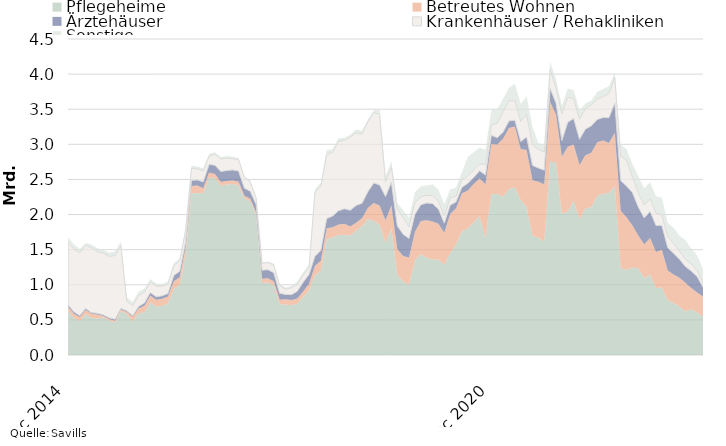
| Category | Pflegeheime | Betreutes Wohnen | Ärztehäuser | Krankenhäuser / Rehakliniken | Sonstige |
|---|---|---|---|---|---|
| 2014-12-01 | 633736081 | 57759854 | 25749999 | 891599738 | 64340644 |
| 2015-01-01 | 530736081 | 57759854 | 25749999 | 891599738 | 71465644 |
| 2015-02-01 | 483168082 | 57759854 | 20749999 | 896099737 | 47465644 |
| 2015-03-01 | 584248082 | 57759854 | 20749999 | 897080987 | 35574599 |
| 2015-04-01 | 529356082 | 57759854 | 15749999 | 924420986 | 46426599 |
| 2015-05-01 | 520608080 | 57759854 | 15749999 | 878720989 | 46426599 |
| 2015-06-01 | 533256112 | 23084854 | 15749999 | 876900990 | 49446599 |
| 2015-07-01 | 490421115 | 23084854 | 15749999 | 875398489 | 52902199 |
| 2015-08-01 | 463331115 | 23084854 | 22535999 | 907658735 | 59202199 |
| 2015-09-01 | 621256115 | 25684854 | 16839999 | 894158738 | 54702200 |
| 2015-10-01 | 587326115 | 25684854 | 16839999 | 139658736 | 52047000 |
| 2015-11-01 | 471877887 | 72825922 | 16839999 | 139508737 | 52047000 |
| 2015-12-01 | 593556246 | 68890922 | 27614999 | 157908739 | 52496999 |
| 2016-01-01 | 606656246 | 93190922 | 41614999 | 153408740 | 50721998 |
| 2016-02-01 | 754539246 | 93190922 | 41614999 | 153858740 | 39721998 |
| 2016-03-01 | 687824246 | 98850422 | 41614999 | 149377489 | 39721998 |
| 2016-04-01 | 701548246 | 98850422 | 41614999 | 136827489 | 28869998 |
| 2016-05-01 | 734016248 | 98850422 | 41614999 | 136827489 | 37869998 |
| 2016-06-01 | 941523216 | 109570422 | 83842999 | 134147490 | 39449998 |
| 2016-07-01 | 997563216 | 109570422 | 83842999 | 153319989 | 28209997 |
| 2016-08-01 | 1418063215 | 109570422 | 80368999 | 163139991 | 26909995 |
| 2016-09-01 | 2301038216 | 106970422 | 78890000 | 174533091 | 31909995 |
| 2016-10-01 | 2307038216 | 106970422 | 78890000 | 160033093 | 30909995 |
| 2016-11-01 | 2302654904 | 70446953 | 92390000 | 156208094 | 32409994 |
| 2016-12-01 | 2523976544 | 74801952 | 115752000 | 118658093 | 33459994 |
| 2017-01-01 | 2522326543 | 55001951 | 125059800 | 158158090 | 28109995 |
| 2017-02-01 | 2407511543 | 55001951 | 149359800 | 178733089 | 28109995 |
| 2017-03-01 | 2428283206 | 49342451 | 149359800 | 177233090 | 28109995 |
| 2017-04-01 | 2436659206 | 49792450 | 149359800 | 159983091 | 28109995 |
| 2017-05-01 | 2416709206 | 54792450 | 149359800 | 164483090 | 19109995 |
| 2017-06-01 | 2230904206 | 38072450 | 107131800 | 154483091 | 16259995 |
| 2017-07-01 | 2187064205 | 38072450 | 107131800 | 133313092 | 14749996 |
| 2017-08-01 | 1991964206 | 38072450 | 111838800 | 93893091 | 9749998 |
| 2017-09-01 | 1026949205 | 59156450 | 121613798 | 101239339 | 11749996 |
| 2017-10-01 | 1032949205 | 59156450 | 122794094 | 101239339 | 11749996 |
| 2017-11-01 | 998051659 | 51823997 | 121994094 | 110189339 | 19607117 |
| 2017-12-01 | 722228264.65 | 64485392.34 | 91375634 | 109439340 | 20394618 |
| 2018-01-01 | 720793264.65 | 73735393.34 | 68067834 | 74639342 | 22894617 |
| 2018-02-01 | 707431263.65 | 75083233.34 | 76967834 | 100209344 | 22894617 |
| 2018-03-01 | 730939600.65 | 75083233.34 | 101967834 | 100209344 | 37894617 |
| 2018-04-01 | 827919601.65 | 74633234.34 | 134166234 | 102309343 | 37894617 |
| 2018-05-01 | 920342101.65 | 94273234.34 | 134166234 | 97809344 | 43894617 |
| 2018-06-01 | 1132462101.65 | 138273234.34 | 134166234 | 912809344 | 42144617 |
| 2018-07-01 | 1200092100.65 | 143673234.34 | 145666234 | 910309345 | 51944617 |
| 2018-08-01 | 1648382098.65 | 157723234.34 | 137647234 | 919564346 | 51944617 |
| 2018-09-01 | 1672277099.66 | 147639234.34 | 158043236 | 907324998 | 44944619 |
| 2018-10-01 | 1707357099.66 | 151089234.34 | 195391740 | 988324994 | 44944619 |
| 2018-11-01 | 1711797099.66 | 155979234.34 | 214712300 | 974149994 | 37837498 |
| 2018-12-01 | 1700270494.01 | 128897840 | 232943760 | 1040049993 | 35549998 |
| 2019-01-01 | 1767835495.01 | 115597839 | 246203760 | 1035349994 | 46839999 |
| 2019-02-01 | 1832357496.01 | 114249999 | 213003760 | 985490494 | 46839999 |
| 2019-03-01 | 1936404184.01 | 156848310 | 233003760 | 994090494 | 33089999 |
| 2019-04-01 | 1913276683.01 | 251948310 | 285155359 | 1002880494 | 33089999 |
| 2019-05-01 | 1855350183.01 | 271883310 | 295091359 | 1009130493 | 65889999 |
| 2019-06-01 | 1600530183.01 | 317883310 | 338910558 | 213630492 | 71139999 |
| 2019-07-01 | 1802250185.01 | 326550262 | 332410558 | 213630492 | 83739997 |
| 2019-08-01 | 1144590186.01 | 363547512 | 332410558 | 240875492 | 83739997 |
| 2019-09-01 | 1046975186 | 363547512 | 308580808 | 235521492 | 105439996 |
| 2019-10-01 | 999895186 | 389797512 | 270052008 | 166221496 | 128973996 |
| 2019-11-01 | 1348676185 | 403512512 | 250531448 | 166518696 | 147173996 |
| 2019-12-01 | 1436021186 | 471912512 | 231531448 | 110118696 | 150234746 |
| 2020-01-01 | 1386087141 | 533140013 | 245211448 | 110118696 | 137444745 |
| 2020-02-01 | 1358892933.36 | 541184833 | 256248136 | 114033196 | 162444745 |
| 2020-03-01 | 1359571245.36 | 509586522 | 211248136 | 109933195 | 164594745 |
| 2020-04-01 | 1285138745.36 | 455118522 | 136898136 | 108543196 | 164594745 |
| 2020-05-01 | 1447483164.36 | 559543521.96 | 126962136 | 102293197 | 125794745 |
| 2020-06-01 | 1572243164.36 | 518143521.96 | 89556937 | 82793198 | 124044744 |
| 2020-07-01 | 1757903270.73 | 545381569.96 | 84556937 | 113523198 | 101644746 |
| 2020-08-01 | 1803513271.73 | 538816589.45 | 102061337 | 103523197 | 274144745 |
| 2020-09-01 | 1888440256.54 | 547632192.28 | 90395087 | 109677196 | 252444746 |
| 2020-10-01 | 1978180292 | 533682192.28 | 111995087 | 97977196 | 228910746 |
| 2020-11-01 | 1665039293 | 767307192.28 | 130112487 | 152879995 | 208460747 |
| 2020-12-01 | 2294464292.86 | 710807192.28 | 124112487 | 143379996 | 207709997 |
| 2021-01-01 | 2291797829.77 | 704629692.28 | 97172487 | 205879995 | 206709998 |
| 2021-02-01 | 2251486125.17 | 827692871.28 | 93575799 | 290996995 | 185699998 |
| 2021-03-01 | 2364136125.17 | 868373933.64 | 100275799 | 286496996 | 184924998 |
| 2021-04-01 | 2389616124.17 | 864137936.64 | 90275800 | 276996996 | 240479998 |
| 2021-05-01 | 2208345705.17 | 724537936.68 | 108436800 | 287996996 | 249129998 |
| 2021-06-01 | 2107366705.17 | 811337936.68 | 186636799 | 321096995 | 254172497 |
| 2021-07-01 | 1698576598.8 | 791700536.68 | 209216799 | 296675495 | 254172497 |
| 2021-08-01 | 1673497598.8 | 794202523.19 | 195212399 | 265675496 | 88536498 |
| 2021-09-01 | 1610965613.99 | 821139920.36 | 200342399 | 258375497 | 111736497 |
| 2021-10-01 | 2750841584.78 | 850609920.36 | 194742399 | 269475497 | 115336497 |
| 2021-11-01 | 2745941584.78 | 678169920.36 | 164124999 | 219275497 | 115336497 |
| 2021-12-01 | 2006821584.92 | 816019920.36 | 231765799 | 375807997 | 119026497 |
| 2022-01-01 | 2042127093.01 | 924632354.36 | 347795798 | 356307998 | 123538497 |
| 2022-02-01 | 2196388858.57 | 800724355.36 | 371855797 | 283040998 | 120548496 |
| 2022-03-01 | 1928563857.57 | 777968293 | 365155797 | 288040998 | 128123495 |
| 2022-04-01 | 2088421001.57 | 757572290 | 371030797 | 291220998 | 72568495 |
| 2022-05-01 | 2102802501.57 | 775809790 | 383877297 | 298220998 | 63918495 |
| 2022-06-01 | 2264316501.57 | 765554139 | 324546350.59 | 289845999 | 100975996 |
| 2022-07-01 | 2295335054.57 | 759514744 | 326355100.59 | 298537499 | 108652496 |
| 2022-08-01 | 2308126327.57 | 712530488 | 358855100.59 | 346837499 | 101788496 |
| 2022-09-01 | 2408147158.07 | 756984931.47 | 423725100.57 | 359337499 | 78588497 |
| 2022-10-01 | 1238706151.82 | 817226096.45 | 428725100.57 | 348237499 | 162293497 |
| 2022-11-01 | 1215191111.82 | 747793596.45 | 442525100.57 | 363237500 | 162293497 |
| 2022-12-01 | 1243513245.82 | 600943596.45 | 468784300.57 | 224805000 | 181293497 |
| 2023-01-01 | 1239216245.82 | 460771162.45 | 407129301.57 | 201304998 | 240031497 |
| 2023-02-01 | 1091671192.5 | 482671162.45 | 378228502.57 | 184304998 | 239031498 |
| 2023-03-01 | 1142914580.5 | 524346162.45 | 378228502.57 | 179304998 | 238331499 |
| 2023-04-01 | 954057437.5 | 513346162.45 | 377353502.57 | 176124998 | 238331499 |
| 2023-05-01 | 961955937.5 | 535708662.45 | 346346002.57 | 158124998 | 238331499 |
| 2023-06-01 | 778960936.5 | 424564313.45 | 325412949.98 | 156649998 | 197731499 |
| 2023-07-01 | 738773068.5 | 408936108.45 | 301024199.98 | 144149997 | 218078999 |
| 2023-08-01 | 689420795.5 | 408936108.45 | 265024199.98 | 115349996 | 221078999 |
| 2023-09-01 | 619604965 | 407728664.98 | 233774200 | 102849996 | 274878998 |
| 2023-10-01 | 652064965 | 302267500 | 241024200 | 102849996 | 218323998 |
| 2023-11-01 | 606200005 | 285540000 | 227224200 | 82849996 | 218323998 |
| 2023-12-01 | 549185871 | 282640000 | 133324200 | 64749996 | 193323998 |